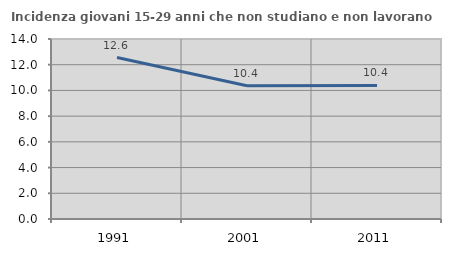
| Category | Incidenza giovani 15-29 anni che non studiano e non lavorano  |
|---|---|
| 1991.0 | 12.561 |
| 2001.0 | 10.37 |
| 2011.0 | 10.392 |